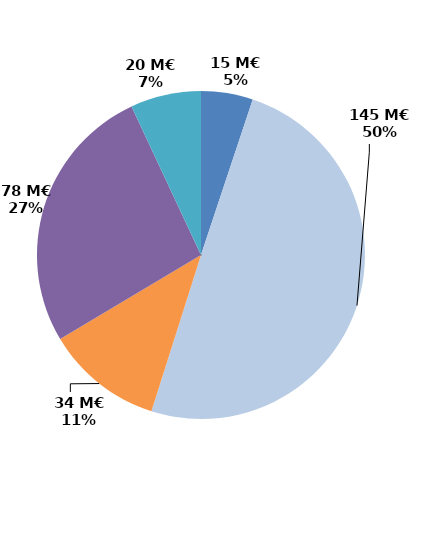
| Category | Series 0 |
|---|---|
| Contrats aidés marchand (hors IAE) | 14.898 |
| Contrats aidés non marchand (hors IAE) | 145.164 |
| Insertion par l'activité économique | 33.672 |
| Mesures en faveur des handicapés | 77.577 |
| Autres emplois aidés | 20.299 |